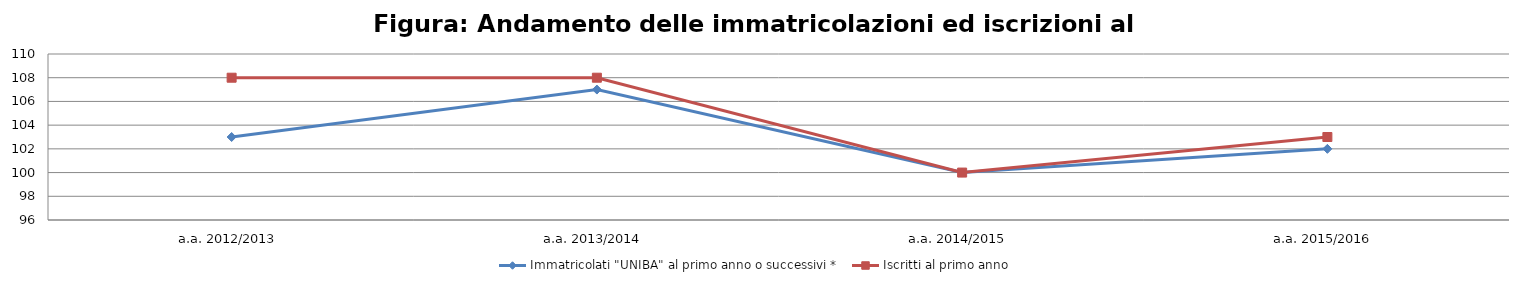
| Category | Immatricolati "UNIBA" al primo anno o successivi * | Iscritti al primo anno  |
|---|---|---|
| a.a. 2012/2013 | 103 | 108 |
| a.a. 2013/2014 | 107 | 108 |
| a.a. 2014/2015 | 100 | 100 |
| a.a. 2015/2016 | 102 | 103 |